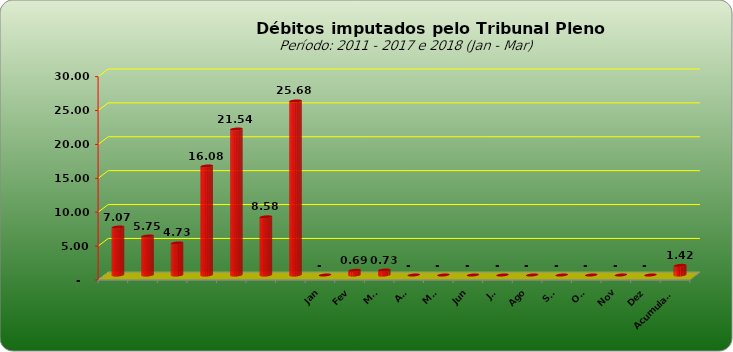
| Category |  7.073.154,74  |
|---|---|
|  | 7073154.74 |
|  | 5749129.25 |
|  | 4727033.51 |
|  | 16081820.48 |
|  | 21535723.6 |
|  | 8578266.09 |
|  | 25676499.17 |
| Jan | 0 |
| Fev | 689867.86 |
| Mar | 729624.1 |
| Abr | 0 |
| Mai | 0 |
| Jun | 0 |
| Jul | 0 |
| Ago | 0 |
| Set | 0 |
| Out | 0 |
| Nov | 0 |
| Dez | 0 |
| Acumulado | 1419491.96 |